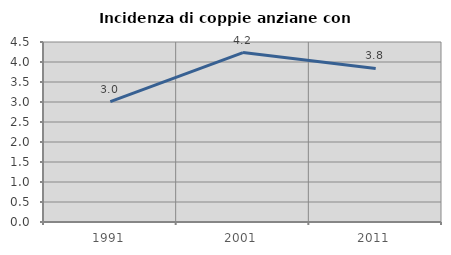
| Category | Incidenza di coppie anziane con figli |
|---|---|
| 1991.0 | 3.011 |
| 2001.0 | 4.236 |
| 2011.0 | 3.84 |